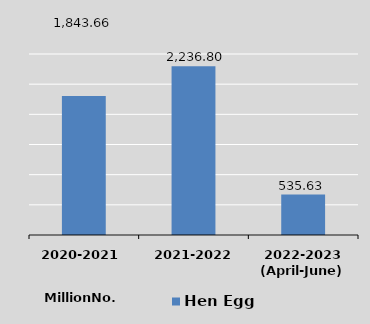
| Category | Hen Egg |
|---|---|
| 2020-2021 | 1843.66 |
| 2021-2022
 | 2236.8 |
| 2022-2023
(April-June) | 535.63 |